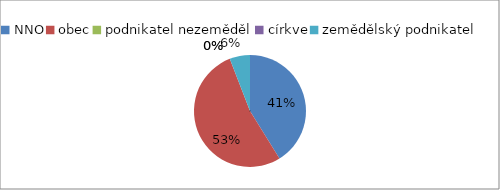
| Category | výzva 1/2009 |
|---|---|
| NNO | 7 |
| obec | 9 |
| podnikatel nezeměděl | 0 |
| církve | 0 |
| zemědělský podnikatel | 1 |